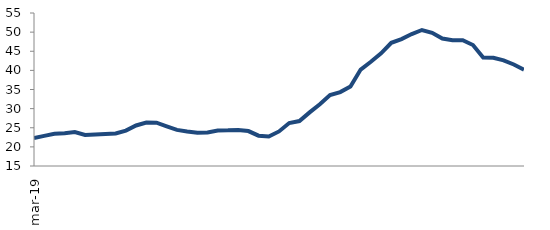
| Category | Series 0 |
|---|---|
| 2019-03-01 | 22.34 |
| 2019-04-01 | 22.879 |
| 2019-05-01 | 23.44 |
| 2019-06-01 | 23.564 |
| 2019-07-01 | 23.893 |
| 2019-08-01 | 23.133 |
| 2019-09-01 | 23.263 |
| 2019-10-01 | 23.369 |
| 2019-11-01 | 23.525 |
| 2019-12-01 | 24.256 |
| 2020-01-01 | 25.597 |
| 2020-02-01 | 26.375 |
| 2020-03-01 | 26.322 |
| 2020-04-01 | 25.369 |
| 2020-05-01 | 24.446 |
| 2020-06-01 | 24.028 |
| 2020-07-01 | 23.685 |
| 2020-08-01 | 23.782 |
| 2020-09-01 | 24.28 |
| 2020-10-01 | 24.323 |
| 2020-11-01 | 24.433 |
| 2020-12-01 | 24.131 |
| 2021-01-01 | 22.928 |
| 2021-02-01 | 22.701 |
| 2021-03-01 | 24.039 |
| 2021-04-01 | 26.229 |
| 2021-05-01 | 26.758 |
| 2021-06-01 | 29.013 |
| 2021-07-01 | 31.153 |
| 2021-08-01 | 33.54 |
| 2021-09-01 | 34.33 |
| 2021-10-01 | 35.804 |
| 2021-11-01 | 40.209 |
| 2021-12-01 | 42.248 |
| 2022-01-01 | 44.446 |
| 2022-02-01 | 47.198 |
| 2022-03-01 | 48.169 |
| 2022-04-01 | 49.498 |
| 2022-05-01 | 50.558 |
| 2022-06-01 | 49.814 |
| 2022-07-01 | 48.326 |
| 2022-08-01 | 47.883 |
| 2022-09-01 | 47.867 |
| 2022-10-01 | 46.623 |
| 2022-11-01 | 43.376 |
| 2022-12-01 | 43.275 |
| 2023-01-01 | 42.634 |
| 2023-02-01 | 41.54 |
| 2023-03-01 | 40.198 |